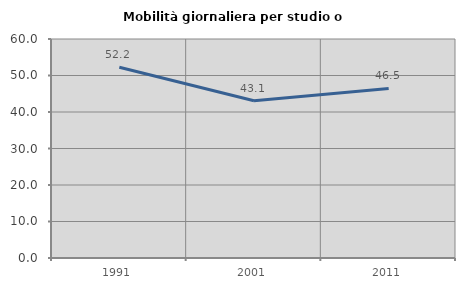
| Category | Mobilità giornaliera per studio o lavoro |
|---|---|
| 1991.0 | 52.242 |
| 2001.0 | 43.082 |
| 2011.0 | 46.47 |